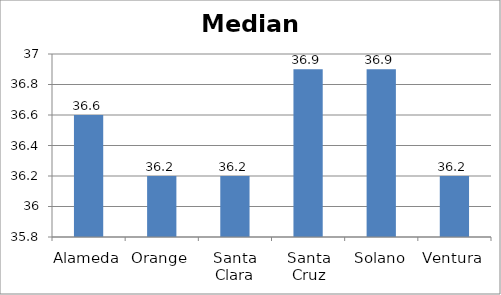
| Category | Series 0 |
|---|---|
| Alameda | 36.6 |
| Orange | 36.2 |
| Santa Clara | 36.2 |
| Santa Cruz | 36.9 |
| Solano | 36.9 |
| Ventura | 36.2 |